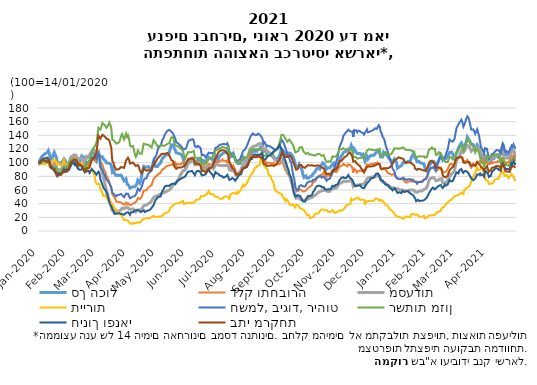
| Category | סך הכול | דלק ותחבורה | מסעדות | תיירות | חשמל, ביגוד, ריהוט | רשתות מזון | חינוך ופנאי | בתי מרקחת |
|---|---|---|---|---|---|---|---|---|
| 2020-01-14 02:00:00 | 100 | 100 | 100 | 100 | 100 | 100 | 100 | 100 |
| 2020-01-15 02:00:00 | 101.719 | 100.675 | 97.889 | 99.187 | 100.368 | 99.831 | 101.454 | 100.52 |
| 2020-01-16 02:00:00 | 105.633 | 101.507 | 98.034 | 98.258 | 101.304 | 100.752 | 99.632 | 102.654 |
| 2020-01-17 02:00:00 | 108.151 | 102.344 | 98.823 | 97.857 | 101.252 | 101.077 | 104.172 | 103.478 |
| 2020-01-19 02:00:00 | 110.992 | 105.256 | 101.43 | 98.079 | 103.331 | 102.45 | 105.805 | 104.144 |
| 2020-01-20 02:00:00 | 111.178 | 103.192 | 100.429 | 97.378 | 102.003 | 101.615 | 104.371 | 102.798 |
| 2020-01-21 02:00:00 | 113.479 | 103.487 | 100.027 | 97.461 | 102.122 | 101.443 | 106.404 | 102.13 |
| 2020-01-22 02:00:00 | 114.641 | 103.743 | 99.753 | 102.685 | 102.122 | 100.95 | 106.817 | 100.976 |
| 2020-01-23 02:00:00 | 114.986 | 103.524 | 100.436 | 103.889 | 102.45 | 101.177 | 107.275 | 101.345 |
| 2020-01-24 02:00:00 | 117.721 | 106.609 | 102.664 | 104.952 | 104.418 | 102.533 | 107.833 | 102.947 |
| 2020-01-25 02:00:00 | 113.464 | 103.999 | 102.363 | 100.911 | 101.921 | 103.315 | 102.781 | 100.925 |
| 2020-01-26 02:00:00 | 107.021 | 97.916 | 94.595 | 96.642 | 94.753 | 93.825 | 96.917 | 93.081 |
| 2020-01-27 02:00:00 | 105.251 | 97.406 | 95.118 | 100.661 | 93.912 | 93.577 | 94.175 | 92.423 |
| 2020-01-28 02:00:00 | 107.242 | 95.445 | 94.555 | 102.276 | 92.051 | 92.396 | 92.933 | 90.928 |
| 2020-01-29 02:00:00 | 111.38 | 96.327 | 94.473 | 104.046 | 89.954 | 92.033 | 90.964 | 90.338 |
| 2020-01-30 02:00:00 | 115.098 | 99.849 | 96.151 | 105.25 | 92.39 | 93.021 | 91.231 | 90.341 |
| 2020-01-31 02:00:00 | 111.621 | 97.377 | 94.997 | 104.581 | 90.288 | 91.893 | 85.803 | 88.161 |
| 2020-02-01 02:00:00 | 108.25 | 94.549 | 95.617 | 101.302 | 88.699 | 93.513 | 82.699 | 87.188 |
| 2020-02-02 02:00:00 | 101.543 | 88.358 | 87.548 | 97.533 | 81.91 | 84.628 | 80.657 | 80.464 |
| 2020-02-03 02:00:00 | 101.785 | 90.542 | 88.887 | 99.883 | 83.316 | 85.655 | 84.454 | 81.676 |
| 2020-02-04 02:00:00 | 99.859 | 90.587 | 89.269 | 100.519 | 83.179 | 85.879 | 83.76 | 81.806 |
| 2020-02-05 02:00:00 | 99.099 | 90.984 | 89.783 | 96.399 | 83.23 | 86.014 | 83.841 | 82.186 |
| 2020-02-06 02:00:00 | 98.222 | 90.545 | 90.21 | 96.225 | 82.773 | 86.142 | 84.734 | 82.392 |
| 2020-02-07 02:00:00 | 97.703 | 90.362 | 90.891 | 96.75 | 82.292 | 86.292 | 84.367 | 82.126 |
| 2020-02-09 02:00:00 | 105.662 | 97.88 | 97.663 | 104.361 | 88.562 | 93.821 | 90.955 | 88.155 |
| 2020-02-10 02:00:00 | 103.636 | 95.556 | 95.475 | 99.274 | 86.435 | 93.483 | 89.142 | 86.505 |
| 2020-02-11 02:00:00 | 100.491 | 95.825 | 95.936 | 97.218 | 86.804 | 94.224 | 89.658 | 87.116 |
| 2020-02-12 02:00:00 | 95.191 | 94.951 | 96.093 | 95.196 | 87.439 | 94.923 | 90.774 | 87.924 |
| 2020-02-13 02:00:00 | 90.377 | 93.073 | 95.613 | 93.881 | 86.568 | 94.93 | 89.582 | 88.46 |
| 2020-02-14 02:00:00 | 93.38 | 96.584 | 99.271 | 94.489 | 92.047 | 98.8 | 89.611 | 91.749 |
| 2020-02-16 02:00:00 | 101.536 | 104.591 | 108.707 | 101.568 | 98.039 | 104.414 | 95.804 | 100.851 |
| 2020-02-17 02:00:00 | 103.605 | 104.858 | 108.703 | 100.023 | 98.947 | 104.459 | 99.492 | 101.633 |
| 2020-02-18 02:00:00 | 104.257 | 105.139 | 109.711 | 99.192 | 99.52 | 104.26 | 98.704 | 102.665 |
| 2020-02-19 02:00:00 | 106.075 | 107.054 | 111.5 | 99.575 | 101.866 | 105.305 | 98.568 | 104.274 |
| 2020-02-20 02:00:00 | 104.535 | 105.161 | 110.417 | 98.567 | 100.268 | 103.775 | 96.525 | 103.419 |
| 2020-02-21 02:00:00 | 105.925 | 105.854 | 110.888 | 102.899 | 101.219 | 104.132 | 99.015 | 103.92 |
| 2020-02-22 02:00:00 | 102.744 | 102.032 | 111.224 | 99.127 | 99.162 | 104.814 | 94.48 | 101.986 |
| 2020-02-23 02:00:00 | 98.285 | 97.319 | 104.088 | 95.454 | 93.448 | 95.587 | 91.306 | 96.193 |
| 2020-02-24 02:00:00 | 100.473 | 99.707 | 106.222 | 95.297 | 96.018 | 96.315 | 92.313 | 98.234 |
| 2020-02-25 02:00:00 | 101.727 | 99.364 | 106.003 | 94.387 | 95.816 | 96.1 | 89.602 | 97.699 |
| 2020-02-26 02:00:00 | 104.764 | 98.872 | 106.635 | 93.646 | 95.546 | 95.946 | 90.157 | 96.51 |
| 2020-02-27 02:00:00 | 109.922 | 99.934 | 106.838 | 99.426 | 95.303 | 95.54 | 90.048 | 95.497 |
| 2020-02-28 02:00:00 | 110.77 | 98.692 | 104.874 | 98.149 | 92.435 | 93.126 | 92.617 | 93.308 |
| 2020-02-29 02:00:00 | 107.864 | 95.535 | 105.712 | 95.238 | 90.942 | 94.896 | 89.065 | 92.184 |
| 2020-03-01 02:00:00 | 104.266 | 93.967 | 98.405 | 91.974 | 88.654 | 89.897 | 85.922 | 86.445 |
| 2020-03-03 02:00:00 | 107.723 | 96.67 | 109.683 | 93.899 | 100.085 | 98.752 | 87.526 | 91.796 |
| 2020-03-04 02:00:00 | 106.619 | 94.586 | 108.375 | 92.089 | 99.224 | 98.327 | 87.485 | 90.827 |
| 2020-03-05 02:00:00 | 108.038 | 97.116 | 109.292 | 91.266 | 101.469 | 100.308 | 87.828 | 92.241 |
| 2020-03-06 02:00:00 | 107.224 | 97.413 | 108.471 | 84.756 | 101.061 | 102.69 | 85.165 | 93.725 |
| 2020-03-08 02:00:00 | 115.291 | 104.878 | 116.022 | 89.549 | 108.438 | 114.274 | 90.747 | 103.157 |
| 2020-03-09 02:00:00 | 117.243 | 106.602 | 117.936 | 87.892 | 109.626 | 118.951 | 89.249 | 105.163 |
| 2020-03-10 02:00:00 | 113.259 | 104.136 | 117.456 | 84.933 | 107.47 | 121.395 | 87.807 | 105.37 |
| 2020-03-11 02:00:00 | 109.121 | 103.596 | 117.904 | 81.863 | 107.87 | 123.358 | 86.39 | 107.5 |
| 2020-03-12 02:00:00 | 103.954 | 102.611 | 117.401 | 71.845 | 107.711 | 124.741 | 86.021 | 110.823 |
| 2020-03-13 02:00:00 | 102.107 | 101.837 | 114.178 | 68.902 | 105.672 | 129.15 | 82.522 | 115.514 |
| 2020-03-15 02:00:00 | 112.893 | 109.767 | 116.43 | 69.147 | 113.355 | 151.094 | 86.794 | 139.217 |
| 2020-03-16 02:00:00 | 112.633 | 106.31 | 109.175 | 67.628 | 109.676 | 150.425 | 84.836 | 139.918 |
| 2020-03-17 02:00:00 | 109.045 | 101.106 | 94.307 | 60.67 | 94.374 | 148.626 | 75.287 | 135.196 |
| 2020-03-18 02:00:00 | 108.389 | 99.095 | 89.722 | 58.197 | 91.285 | 152.452 | 71.262 | 136.634 |
| 2020-03-19 02:00:00 | 108.531 | 97.326 | 85.316 | 55.349 | 89.505 | 158.26 | 67.71 | 140.809 |
| 2020-03-20 02:00:00 | 105.203 | 91.731 | 78.354 | 51.103 | 85.228 | 156.918 | 63.256 | 139.818 |
| 2020-03-22 02:00:00 | 102.98 | 86.171 | 66.185 | 52.196 | 79.857 | 154.023 | 59.757 | 137.392 |
| 2020-03-23 02:00:00 | 99.615 | 80.331 | 60.019 | 48.964 | 75.181 | 151.082 | 56.444 | 135.05 |
| 2020-03-24 02:00:00 | 99.873 | 78.885 | 55.711 | 46.602 | 74.68 | 152.124 | 53.405 | 134.763 |
| 2020-03-25 02:00:00 | 99.537 | 76.109 | 49.61 | 44.72 | 72.283 | 154.924 | 48.09 | 134.163 |
| 2020-03-26 02:00:00 | 98.686 | 71.636 | 44.521 | 42.548 | 69.755 | 158.765 | 42.499 | 132.161 |
| 2020-03-27 03:00:00 | 98.366 | 67.054 | 40.285 | 44.357 | 66.947 | 155.241 | 38.336 | 127.043 |
| 2020-03-28 03:00:00 | 95.898 | 63.28 | 38.998 | 41.801 | 63.38 | 151.775 | 36.34 | 121.831 |
| 2020-03-29 03:00:00 | 87.58 | 54.069 | 30.097 | 39.142 | 56.211 | 133.651 | 32.36 | 102.82 |
| 2020-03-30 03:00:00 | 90.27 | 54.274 | 30.224 | 37.177 | 56.51 | 134.987 | 30.275 | 100.366 |
| 2020-03-31 03:00:00 | 84.833 | 49.558 | 29.007 | 34.09 | 53.456 | 132.123 | 25.257 | 95.457 |
| 2020-04-01 03:00:00 | 84.752 | 47.369 | 28.96 | 32.147 | 53.447 | 132.594 | 25.167 | 94.966 |
| 2020-04-02 03:00:00 | 81.239 | 43.058 | 28.035 | 31.116 | 50.762 | 127.932 | 25.389 | 89.783 |
| 2020-04-03 03:00:00 | 82.341 | 43.204 | 28.733 | 30.276 | 52.456 | 129.037 | 26.089 | 90.962 |
| 2020-04-05 03:00:00 | 81.664 | 42.474 | 29.249 | 24.823 | 53.079 | 129.716 | 26.034 | 90.691 |
| 2020-04-06 03:00:00 | 81.228 | 42.227 | 29.829 | 23.937 | 54.113 | 133.964 | 25.739 | 91.941 |
| 2020-04-07 03:00:00 | 81.755 | 41.753 | 31.166 | 23.451 | 54.147 | 139.173 | 25.285 | 93.675 |
| 2020-04-08 03:00:00 | 81.318 | 40.957 | 33.395 | 22.614 | 53.184 | 141.811 | 24.879 | 94.478 |
| 2020-04-10 03:00:00 | 73.425 | 38.374 | 32.604 | 15.949 | 49.446 | 134.052 | 23.794 | 92.402 |
| 2020-04-12 03:00:00 | 76.159 | 41.493 | 34.639 | 16.341 | 54.714 | 142.463 | 26.455 | 102.973 |
| 2020-04-13 03:00:00 | 69.273 | 39.019 | 33.807 | 15.351 | 53.435 | 137.528 | 27.174 | 103.298 |
| 2020-04-14 03:00:00 | 70.607 | 40.818 | 33.87 | 14.924 | 54.632 | 140.264 | 27.564 | 107.261 |
| 2020-04-15 03:00:00 | 66.077 | 38.599 | 32.55 | 13.229 | 51.143 | 135.52 | 25.827 | 104.498 |
| 2020-04-16 03:00:00 | 62.727 | 37.498 | 31.511 | 10.961 | 47.899 | 125.332 | 23.757 | 98.815 |
| 2020-04-17 03:00:00 | 63.283 | 38.127 | 31.695 | 10.539 | 48.377 | 123.495 | 27.193 | 99.075 |
| 2020-04-19 03:00:00 | 64.789 | 40.263 | 32.369 | 10.577 | 50.347 | 124.42 | 27.48 | 100.193 |
| 2020-04-20 03:00:00 | 64.357 | 39.745 | 31.732 | 12.079 | 49.736 | 119.15 | 28.563 | 98.648 |
| 2020-04-21 03:00:00 | 64.683 | 41.292 | 29.942 | 11.672 | 51.252 | 112.309 | 29.885 | 96.784 |
| 2020-04-22 03:00:00 | 66.693 | 42.805 | 27.887 | 11.477 | 53.331 | 108.433 | 30.804 | 95.017 |
| 2020-04-23 03:00:00 | 68.829 | 44.539 | 28.672 | 11.899 | 56.511 | 111.171 | 30.542 | 94.686 |
| 2020-04-24 03:00:00 | 74.331 | 48.338 | 30.963 | 12.807 | 61.97 | 117.763 | 31.668 | 96.631 |
| 2020-04-25 03:00:00 | 72.357 | 47.486 | 31.164 | 12.156 | 60.708 | 118.632 | 30.038 | 94.339 |
| 2020-04-26 03:00:00 | 70.102 | 46.694 | 30.572 | 12.257 | 58.913 | 112.985 | 28.727 | 88.331 |
| 2020-04-27 03:00:00 | 73.251 | 48.46 | 31.87 | 12.694 | 62.064 | 113.021 | 27.693 | 86.921 |
| 2020-04-28 03:00:00 | 82.697 | 50.267 | 32.58 | 15.337 | 64.845 | 113.257 | 27.798 | 84.358 |
| 2020-04-30 03:00:00 | 94.71 | 59.018 | 37.035 | 17.716 | 74.402 | 127.835 | 30.371 | 91.737 |
| 2020-05-01 03:00:00 | 94.037 | 59.748 | 37.796 | 18.362 | 76.609 | 128.601 | 27.746 | 90.074 |
| 2020-05-03 03:00:00 | 93.188 | 59.734 | 38.151 | 18.751 | 77.551 | 126.407 | 29.332 | 88.218 |
| 2020-05-04 03:00:00 | 94.575 | 62.695 | 39.154 | 17.862 | 82.073 | 126.692 | 29.753 | 88.639 |
| 2020-05-05 03:00:00 | 94.164 | 64.153 | 40.516 | 18.29 | 84.388 | 126.182 | 30.101 | 89.11 |
| 2020-05-06 03:00:00 | 92.201 | 64.982 | 41.189 | 18.981 | 85.956 | 124.213 | 31.114 | 88.195 |
| 2020-05-07 03:00:00 | 91.695 | 65.995 | 41.851 | 19.639 | 87.105 | 123.227 | 31.925 | 87.891 |
| 2020-05-08 03:00:00 | 90.672 | 67.157 | 42.866 | 20.201 | 89.227 | 122.257 | 33.086 | 87.863 |
| 2020-05-10 03:00:00 | 101.85 | 76.175 | 49.032 | 22.241 | 102.142 | 133.066 | 37.779 | 96.685 |
| 2020-05-11 03:00:00 | 102.039 | 77.848 | 49.587 | 22.575 | 105.865 | 131.1 | 42.014 | 97.752 |
| 2020-05-12 03:00:00 | 94.508 | 79.596 | 50.868 | 20.319 | 109.237 | 128.596 | 45.292 | 101.183 |
| 2020-05-13 03:00:00 | 94.399 | 80.254 | 50.707 | 20.512 | 111.178 | 126.939 | 45.646 | 103.175 |
| 2020-05-14 03:00:00 | 94.363 | 81.756 | 51.422 | 20.914 | 117.87 | 123.912 | 48.584 | 105.994 |
| 2020-05-15 03:00:00 | 96.58 | 83.253 | 52.83 | 21.066 | 121.781 | 124.219 | 50.135 | 107.544 |
| 2020-05-17 03:00:00 | 99.44 | 85.28 | 53.929 | 21.349 | 124.96 | 125.098 | 50.291 | 110.705 |
| 2020-05-18 03:00:00 | 102.953 | 86.632 | 54.455 | 21.491 | 128.242 | 124.447 | 54.852 | 112.593 |
| 2020-05-19 03:00:00 | 106.277 | 90.09 | 55.635 | 22.193 | 133.509 | 125.253 | 58.552 | 113.344 |
| 2020-05-20 03:00:00 | 106.535 | 89.687 | 55.551 | 23.944 | 135.179 | 124.013 | 60.22 | 112.959 |
| 2020-05-21 03:00:00 | 109.106 | 91.524 | 56.241 | 25.631 | 139.582 | 124.546 | 64.056 | 113.156 |
| 2020-05-22 03:00:00 | 111.157 | 93.446 | 56.883 | 26.393 | 142.481 | 125.447 | 65.712 | 113.244 |
| 2020-05-24 03:00:00 | 111.578 | 95.488 | 58.612 | 27.196 | 146.606 | 127.338 | 66.231 | 114.232 |
| 2020-05-25 03:00:00 | 111.341 | 95.688 | 59.193 | 28.195 | 147.338 | 127.601 | 65.75 | 112.757 |
| 2020-05-26 03:00:00 | 114.874 | 95.988 | 60.035 | 29.089 | 147.987 | 128.64 | 65.961 | 110.41 |
| 2020-05-27 03:00:00 | 120.222 | 96.415 | 60.9 | 34.145 | 148.568 | 133.007 | 67.693 | 107.386 |
| 2020-05-28 03:00:00 | 126.049 | 96.776 | 63.111 | 34.849 | 145.563 | 136.853 | 68.551 | 103.92 |
| 2020-05-30 03:00:00 | 125.542 | 98.217 | 67.639 | 37.749 | 142.111 | 137.467 | 69.563 | 102.153 |
| 2020-05-31 03:00:00 | 121.33 | 97.835 | 67.793 | 38.198 | 138.578 | 128.298 | 68.352 | 94.675 |
| 2020-06-01 03:00:00 | 118.588 | 100.349 | 69.31 | 39.983 | 135.99 | 127.866 | 68.459 | 92.938 |
| 2020-06-02 03:00:00 | 114.257 | 95.213 | 69.823 | 41.177 | 129.82 | 124.798 | 69.765 | 90.992 |
| 2020-06-03 03:00:00 | 115.27 | 97.843 | 72.603 | 40.649 | 130.562 | 125.007 | 73.05 | 92.44 |
| 2020-06-04 03:00:00 | 113.873 | 97.548 | 74.905 | 39.941 | 128.4 | 123.76 | 73.23 | 92.963 |
| 2020-06-05 03:00:00 | 112.928 | 97.569 | 77.986 | 40.982 | 126.604 | 122.371 | 74.977 | 92.858 |
| 2020-06-07 03:00:00 | 111.938 | 97.668 | 84.038 | 42.241 | 124.318 | 120.331 | 76.627 | 92.824 |
| 2020-06-08 03:00:00 | 110.397 | 98.325 | 85.566 | 42.541 | 122.07 | 118.825 | 77.192 | 93.299 |
| 2020-06-09 03:00:00 | 106.679 | 100.834 | 88.142 | 43.749 | 122.605 | 116.148 | 78.09 | 94.412 |
| 2020-06-10 03:00:00 | 99.9 | 98.978 | 89.11 | 39.378 | 119.381 | 110.388 | 77.626 | 94.016 |
| 2020-06-11 03:00:00 | 94.233 | 98.162 | 89.18 | 39.723 | 119.824 | 105.822 | 79.689 | 95.611 |
| 2020-06-12 03:00:00 | 96.318 | 99.362 | 90.958 | 40.735 | 121.052 | 109.488 | 80.979 | 96.751 |
| 2020-06-14 03:00:00 | 101.323 | 105.561 | 98.946 | 41.535 | 129.919 | 115.385 | 86.617 | 104.4 |
| 2020-06-15 03:00:00 | 102.995 | 103.99 | 99.789 | 41.284 | 132.29 | 115.064 | 87.28 | 104.698 |
| 2020-06-16 03:00:00 | 105.003 | 105.28 | 100.434 | 40.596 | 133.445 | 115.114 | 87.231 | 105.499 |
| 2020-06-17 03:00:00 | 106.023 | 106.03 | 101.537 | 40.952 | 133.724 | 115.534 | 87.668 | 105.797 |
| 2020-06-18 03:00:00 | 106.519 | 106.788 | 102.259 | 41.275 | 134.094 | 115.789 | 87.951 | 106.345 |
| 2020-06-19 03:00:00 | 106.708 | 107.302 | 103.449 | 42.541 | 134.347 | 116.065 | 87.821 | 106.848 |
| 2020-06-20 03:00:00 | 103.911 | 103.808 | 103.575 | 41.493 | 131.495 | 116.942 | 83.997 | 104.843 |
| 2020-06-21 03:00:00 | 99.238 | 99.737 | 96.844 | 40.37 | 123.892 | 107.383 | 81.794 | 98.769 |
| 2020-06-22 03:00:00 | 101.129 | 100.743 | 96.86 | 45.403 | 124.429 | 107.524 | 85.575 | 99.09 |
| 2020-06-23 03:00:00 | 101.545 | 99.073 | 97.096 | 45.257 | 122.796 | 106.965 | 87.528 | 98.282 |
| 2020-06-24 03:00:00 | 103.65 | 101.454 | 98.357 | 45.937 | 124.626 | 107.861 | 88.879 | 99.125 |
| 2020-06-25 03:00:00 | 103.296 | 100.817 | 98.353 | 46.215 | 123.458 | 106.995 | 88.065 | 97.925 |
| 2020-06-26 03:00:00 | 105.717 | 100.163 | 98.326 | 46.849 | 122.522 | 106.414 | 88.272 | 96.519 |
| 2020-06-27 03:00:00 | 103.642 | 97.286 | 98.49 | 51.029 | 120.257 | 107.656 | 85.032 | 95.278 |
| 2020-06-28 03:00:00 | 97.893 | 89.94 | 89.75 | 49.867 | 110.973 | 97.977 | 81.396 | 87.99 |
| 2020-06-29 03:00:00 | 103.23 | 92.215 | 90.379 | 50.807 | 110.313 | 98.632 | 81.857 | 88.066 |
| 2020-06-30 03:00:00 | 103.773 | 95.221 | 90.888 | 51.389 | 111.501 | 99.233 | 82.076 | 88.052 |
| 2020-07-01 03:00:00 | 102.602 | 94.786 | 91.244 | 51.844 | 110.769 | 98.622 | 81.012 | 87.34 |
| 2020-07-02 03:00:00 | 101.095 | 92.279 | 90.37 | 53.101 | 107.877 | 97.543 | 83.073 | 85.687 |
| 2020-07-03 03:00:00 | 101.196 | 91.955 | 89.846 | 53.71 | 107.572 | 97.813 | 83.996 | 85.505 |
| 2020-07-05 03:00:00 | 108.13 | 98.225 | 95.154 | 58.258 | 114.64 | 105.492 | 90.256 | 91.78 |
| 2020-07-06 03:00:00 | 107.24 | 97.302 | 95.317 | 54.42 | 114.29 | 105.866 | 87.29 | 91.669 |
| 2020-07-07 03:00:00 | 106.167 | 96.895 | 94.138 | 54.146 | 113.91 | 106.384 | 85.127 | 91.734 |
| 2020-07-08 03:00:00 | 105.715 | 96.695 | 93.417 | 54.17 | 113.102 | 106.959 | 84.022 | 91.581 |
| 2020-07-09 03:00:00 | 105.07 | 98.124 | 93.561 | 53.956 | 114.17 | 108.312 | 82.233 | 94.188 |
| 2020-07-10 03:00:00 | 100.144 | 95.486 | 91.302 | 53.155 | 111.881 | 107.649 | 78.868 | 95.484 |
| 2020-07-12 03:00:00 | 108.063 | 103.866 | 96.905 | 50.275 | 121.805 | 117.902 | 86.169 | 106.488 |
| 2020-07-13 03:00:00 | 101.728 | 100.806 | 96.146 | 49.816 | 121.105 | 117.546 | 84.601 | 108.258 |
| 2020-07-14 03:00:00 | 103.301 | 101.434 | 97.077 | 49.822 | 122.643 | 119.063 | 83.963 | 112.047 |
| 2020-07-15 03:00:00 | 106.247 | 101.153 | 96.27 | 49.046 | 124.828 | 119.753 | 83.523 | 115.114 |
| 2020-07-16 03:00:00 | 108.925 | 101.986 | 96.108 | 47.405 | 125.619 | 120.587 | 81.52 | 116.291 |
| 2020-07-17 03:00:00 | 111.049 | 102.415 | 95.988 | 47.009 | 126.179 | 121.905 | 80.864 | 117.634 |
| 2020-07-19 03:00:00 | 112.895 | 104.723 | 95.579 | 46.997 | 127.171 | 123.058 | 79.814 | 118.312 |
| 2020-07-20 03:00:00 | 111.925 | 102.595 | 95.047 | 46.469 | 126.248 | 122.249 | 78.003 | 117.533 |
| 2020-07-21 03:00:00 | 114.765 | 102.924 | 95.93 | 50.36 | 127.181 | 122.145 | 78.869 | 117.617 |
| 2020-07-22 03:00:00 | 115.981 | 102.912 | 96.238 | 50.332 | 128.136 | 122.002 | 79.082 | 117.685 |
| 2020-07-23 03:00:00 | 115.281 | 101.004 | 95.743 | 50.457 | 126.647 | 120.958 | 80.608 | 115.093 |
| 2020-07-24 03:00:00 | 117.295 | 103.499 | 97.14 | 51.188 | 128.372 | 122.363 | 82.14 | 113.819 |
| 2020-07-25 03:00:00 | 113.398 | 99.602 | 96.218 | 49.451 | 125.205 | 122.992 | 78.778 | 110.79 |
| 2020-07-26 03:00:00 | 106.743 | 95.007 | 89.719 | 47.459 | 116.562 | 112.192 | 74.736 | 101.518 |
| 2020-07-27 03:00:00 | 106.335 | 94.463 | 89.325 | 53.399 | 114.876 | 111.74 | 75.828 | 99.054 |
| 2020-07-28 03:00:00 | 109.634 | 91.999 | 88.535 | 53.816 | 112.027 | 110.671 | 75.916 | 95.317 |
| 2020-07-29 03:00:00 | 111.616 | 92.899 | 88.452 | 55.064 | 109.782 | 110.86 | 77.669 | 92.351 |
| 2020-07-30 03:00:00 | 113.486 | 95.877 | 88.238 | 55.817 | 112.446 | 111.75 | 77.412 | 92.105 |
| 2020-07-31 03:00:00 | 108.891 | 92.357 | 86.477 | 55.7 | 109.083 | 108.868 | 75.775 | 89.354 |
| 2020-08-01 03:00:00 | 105.873 | 89.504 | 86.431 | 54.743 | 107.918 | 110.118 | 73.476 | 88.307 |
| 2020-08-02 03:00:00 | 101.137 | 85.213 | 81.595 | 53.926 | 102.2 | 100.519 | 74.052 | 82.572 |
| 2020-08-03 03:00:00 | 100.575 | 85.332 | 82.149 | 57.032 | 102.491 | 100.355 | 77.533 | 82.69 |
| 2020-08-04 03:00:00 | 98.623 | 85.298 | 82.607 | 55.299 | 103.449 | 100.342 | 80.009 | 83.011 |
| 2020-08-05 03:00:00 | 98.539 | 85.668 | 84.684 | 56.821 | 104.114 | 100.326 | 81.928 | 83.93 |
| 2020-08-06 03:00:00 | 98.742 | 86.005 | 86.285 | 58.22 | 105.007 | 100.106 | 82.584 | 84.524 |
| 2020-08-07 03:00:00 | 99.021 | 86.381 | 87.558 | 60.742 | 105.727 | 99.576 | 83.256 | 84.514 |
| 2020-08-09 03:00:00 | 108.227 | 95.68 | 97.909 | 67.581 | 116.933 | 107.822 | 91.34 | 92.251 |
| 2020-08-10 03:00:00 | 106.073 | 94.236 | 98.555 | 65.383 | 116.811 | 107.227 | 90.02 | 91.531 |
| 2020-08-11 03:00:00 | 102.439 | 95.453 | 100.334 | 66.826 | 119.656 | 107.912 | 92.342 | 92.722 |
| 2020-08-12 03:00:00 | 99.757 | 95.404 | 102.231 | 68.158 | 121.634 | 107.847 | 92.902 | 94.197 |
| 2020-08-13 03:00:00 | 97.527 | 94.715 | 105.094 | 70.047 | 122.22 | 107.587 | 93.894 | 94.66 |
| 2020-08-14 03:00:00 | 101.719 | 99.337 | 109.564 | 73.68 | 128.466 | 110.262 | 96.827 | 97.289 |
| 2020-08-16 03:00:00 | 109.628 | 105.69 | 119.005 | 79.564 | 136.342 | 117.852 | 104.279 | 105.362 |
| 2020-08-17 03:00:00 | 113.919 | 109.129 | 121.104 | 83.084 | 139.43 | 119.273 | 105.47 | 107.21 |
| 2020-08-18 03:00:00 | 114.95 | 109.977 | 122.143 | 83.499 | 140.062 | 119.595 | 105.212 | 108.098 |
| 2020-08-19 03:00:00 | 116.396 | 112.412 | 123.409 | 85.16 | 142.836 | 120.767 | 109.264 | 108.515 |
| 2020-08-20 03:00:00 | 115.289 | 110.497 | 123.008 | 86.008 | 140.936 | 119.861 | 109.702 | 107.391 |
| 2020-08-21 03:00:00 | 116.839 | 111.123 | 124.572 | 92.474 | 142.127 | 120.292 | 111.993 | 107.967 |
| 2020-08-23 03:00:00 | 116.719 | 109.299 | 125.006 | 93.592 | 140.564 | 119.605 | 111.452 | 107.855 |
| 2020-08-24 03:00:00 | 118.995 | 112.139 | 126.984 | 95.94 | 142.482 | 120.737 | 112.633 | 109.348 |
| 2020-08-25 03:00:00 | 118.563 | 111.658 | 127.401 | 96.313 | 141.779 | 119.91 | 111.128 | 108.828 |
| 2020-08-26 03:00:00 | 119.732 | 111.01 | 128.056 | 96.935 | 140.907 | 119.507 | 111.11 | 108.068 |
| 2020-08-27 03:00:00 | 123.506 | 110.551 | 128.6 | 104.931 | 140.226 | 119.354 | 112.517 | 107.982 |
| 2020-08-28 03:00:00 | 125.485 | 109.073 | 128.034 | 105.548 | 137.103 | 117.807 | 114.123 | 106.735 |
| 2020-08-29 03:00:00 | 122.309 | 106.255 | 127.224 | 101.291 | 133.566 | 118.733 | 109.094 | 104.397 |
| 2020-08-30 03:00:00 | 116.847 | 101.292 | 119.589 | 98.146 | 127.741 | 109.715 | 104.063 | 98.117 |
| 2020-08-31 03:00:00 | 117.719 | 103.765 | 120.177 | 93.606 | 129.659 | 110.434 | 104.872 | 97.47 |
| 2020-09-01 03:00:00 | 117.042 | 103.199 | 119.845 | 92.921 | 128.733 | 110.652 | 105.192 | 97.168 |
| 2020-09-02 03:00:00 | 113.883 | 98.378 | 116.4 | 91.423 | 123.497 | 108.948 | 106.381 | 95.257 |
| 2020-09-03 03:00:00 | 115.928 | 100.185 | 115.668 | 89.813 | 125.126 | 110.859 | 109.705 | 95.835 |
| 2020-09-04 03:00:00 | 114.368 | 99.651 | 113.979 | 82.428 | 123.732 | 111.174 | 109.995 | 95.421 |
| 2020-09-06 03:00:00 | 113.837 | 99.487 | 112.142 | 80.411 | 123.373 | 111.641 | 110.832 | 96.082 |
| 2020-09-07 03:00:00 | 113.304 | 98.944 | 110.37 | 75.243 | 122.735 | 111.86 | 112.797 | 95.998 |
| 2020-09-08 03:00:00 | 111.925 | 98.345 | 108.629 | 73.337 | 121.444 | 112.863 | 114.553 | 95.675 |
| 2020-09-09 03:00:00 | 111.3 | 99.891 | 107.502 | 71.134 | 122.45 | 115.133 | 116.566 | 96.374 |
| 2020-09-10 03:00:00 | 106.111 | 97.444 | 104.787 | 61.869 | 119.115 | 114.928 | 115.509 | 95.59 |
| 2020-09-11 03:00:00 | 105.67 | 97.725 | 103.467 | 58.941 | 119.491 | 117.182 | 118.697 | 96.714 |
| 2020-09-12 03:00:00 | 106.138 | 97.069 | 102.641 | 58.021 | 120.298 | 119.473 | 119.576 | 97.989 |
| 2020-09-13 03:00:00 | 105.871 | 98.687 | 102.885 | 57.124 | 120.759 | 120.219 | 120.015 | 98.834 |
| 2020-09-14 03:00:00 | 106.629 | 97.619 | 102.434 | 55.819 | 121.405 | 123.598 | 123.75 | 102.687 |
| 2020-09-15 03:00:00 | 109.962 | 97.777 | 102.227 | 55.241 | 125.232 | 128.823 | 126.11 | 104.606 |
| 2020-09-16 03:00:00 | 115.246 | 98.805 | 103.134 | 54.408 | 128.296 | 133.889 | 122.429 | 107.959 |
| 2020-09-17 03:00:00 | 120.253 | 101.931 | 105.932 | 54.481 | 133.684 | 140.657 | 120.25 | 112.807 |
| 2020-09-18 03:00:00 | 121.111 | 100.153 | 106.042 | 51.646 | 134.9 | 141.821 | 116.363 | 115.779 |
| 2020-09-19 03:00:00 | 117.15 | 96.735 | 102.232 | 49.133 | 130.088 | 140.328 | 109.595 | 114.428 |
| 2020-09-21 03:00:00 | 113.151 | 89.412 | 94.549 | 43.816 | 121.979 | 135.066 | 102.977 | 108.762 |
| 2020-09-22 03:00:00 | 113.91 | 87.461 | 92.47 | 46.705 | 117.898 | 133.095 | 98.513 | 109.011 |
| 2020-09-23 03:00:00 | 111.917 | 83.647 | 89.185 | 44.936 | 111.779 | 130.512 | 93.383 | 108.198 |
| 2020-09-24 03:00:00 | 114.1 | 83.735 | 86.459 | 43.322 | 110.531 | 131.467 | 90.725 | 109.25 |
| 2020-09-25 03:00:00 | 114.25 | 81.698 | 82.052 | 39.17 | 106.733 | 133.769 | 83.277 | 110.693 |
| 2020-09-26 03:00:00 | 114.073 | 79.97 | 76.952 | 38.027 | 101.99 | 132.041 | 80.238 | 110.267 |
| 2020-09-27 03:00:00 | 113.582 | 76.036 | 71.92 | 37.714 | 99.863 | 131.408 | 77.849 | 108.807 |
| 2020-09-29 03:00:00 | 108.159 | 68.181 | 64.233 | 38.579 | 80.694 | 125.32 | 58.373 | 100.574 |
| 2020-09-30 03:00:00 | 104.052 | 66.921 | 60.195 | 36.579 | 76.704 | 120.554 | 53.969 | 97.917 |
| 2020-10-01 03:00:00 | 97.671 | 60.683 | 53.553 | 34.653 | 66.463 | 115.083 | 50.286 | 93.007 |
| 2020-10-02 03:00:00 | 94.082 | 58.038 | 48.086 | 38.125 | 60.854 | 114.088 | 51.063 | 89.754 |
| 2020-10-04 03:00:00 | 94.791 | 58.757 | 49.273 | 37.618 | 59.854 | 116.646 | 52.393 | 91.401 |
| 2020-10-05 03:00:00 | 97.723 | 61.545 | 47.759 | 38.336 | 65.475 | 120.828 | 53.372 | 96.293 |
| 2020-10-06 03:00:00 | 94.728 | 60.922 | 46.629 | 32.96 | 66.373 | 122.68 | 51.187 | 96.592 |
| 2020-10-07 03:00:00 | 92.131 | 60.113 | 45.623 | 32.46 | 67.015 | 123.367 | 48.253 | 96.583 |
| 2020-10-08 03:00:00 | 88.57 | 59.395 | 45.688 | 32.416 | 66.922 | 122.561 | 45.533 | 96.182 |
| 2020-10-09 03:00:00 | 81.944 | 57.854 | 44.938 | 31.839 | 65.369 | 117.585 | 43.099 | 93.373 |
| 2020-10-10 03:00:00 | 78.441 | 57.524 | 45.006 | 30.357 | 64.813 | 115.571 | 42.693 | 92.06 |
| 2020-10-11 03:00:00 | 77.905 | 58.15 | 45.301 | 28.432 | 65.115 | 115.453 | 43.035 | 92.397 |
| 2020-10-12 03:00:00 | 80.446 | 59.791 | 45.241 | 27.989 | 67.214 | 112.858 | 46.108 | 94.035 |
| 2020-10-13 03:00:00 | 77.282 | 60.658 | 46.402 | 23.422 | 70.322 | 112.915 | 48.941 | 95.182 |
| 2020-10-14 03:00:00 | 77.574 | 62.986 | 47.354 | 23.225 | 71.3 | 114.37 | 51.228 | 96.342 |
| 2020-10-15 03:00:00 | 77.92 | 63.943 | 47.587 | 23.074 | 72.273 | 112.098 | 51.225 | 95.945 |
| 2020-10-16 03:00:00 | 79.425 | 64.778 | 47.941 | 19.015 | 72.247 | 110.709 | 51.406 | 95.7 |
| 2020-10-18 03:00:00 | 80.543 | 66.764 | 49.062 | 19.843 | 72.545 | 111.632 | 52.408 | 96.442 |
| 2020-10-19 03:00:00 | 83.37 | 70.671 | 50.572 | 20.966 | 74.737 | 112.11 | 56.73 | 96.813 |
| 2020-10-20 03:00:00 | 83.468 | 70.646 | 50.854 | 21.502 | 74.364 | 110.584 | 58.396 | 95.239 |
| 2020-10-21 03:00:00 | 86.118 | 72.689 | 51.755 | 24.833 | 75.429 | 110.585 | 61.091 | 95.396 |
| 2020-10-22 03:00:00 | 87.353 | 74.742 | 52.918 | 24.927 | 76.847 | 110.95 | 63.735 | 95.465 |
| 2020-10-23 03:00:00 | 91.352 | 77.059 | 54.411 | 25.591 | 78.025 | 111.768 | 65.441 | 95.484 |
| 2020-10-24 03:00:00 | 92.532 | 79.216 | 55.859 | 26.105 | 79.245 | 113.037 | 65.933 | 96.072 |
| 2020-10-25 02:00:00 | 92.367 | 80.718 | 57.082 | 26.357 | 79.416 | 113.07 | 66.334 | 96.159 |
| 2020-10-26 02:00:00 | 90.798 | 81.457 | 57.677 | 26.685 | 79.604 | 112.469 | 65.988 | 95.317 |
| 2020-10-27 02:00:00 | 94.611 | 82.221 | 58.127 | 31.154 | 80.052 | 111.657 | 65.755 | 94.715 |
| 2020-10-28 02:00:00 | 97.227 | 81.283 | 58.213 | 31.562 | 78.198 | 110.055 | 64.004 | 92.74 |
| 2020-10-29 02:00:00 | 99.721 | 83.186 | 59.013 | 31.698 | 78.143 | 109.892 | 64.75 | 92.154 |
| 2020-10-30 02:00:00 | 100.178 | 85.878 | 60.553 | 31.823 | 79.999 | 110.928 | 64.255 | 91.941 |
| 2020-10-31 02:00:00 | 97.073 | 84.214 | 60.725 | 30.552 | 77.729 | 112.207 | 61.553 | 90.712 |
| 2020-11-01 02:00:00 | 93.663 | 83.4 | 58.788 | 30.115 | 76.228 | 103.089 | 60.498 | 85.505 |
| 2020-11-02 02:00:00 | 91.023 | 79.446 | 57.531 | 30.441 | 73.595 | 101.123 | 60.46 | 83.311 |
| 2020-11-03 02:00:00 | 92.628 | 81.41 | 58.141 | 30.536 | 75.44 | 102.037 | 61.502 | 84.35 |
| 2020-11-04 02:00:00 | 91.899 | 81.477 | 58.188 | 27.926 | 75.952 | 101.969 | 61.06 | 83.996 |
| 2020-11-05 02:00:00 | 92.278 | 81.192 | 57.873 | 27.815 | 76.321 | 101.553 | 60.729 | 83.129 |
| 2020-11-06 02:00:00 | 90.816 | 80.787 | 57.774 | 28.166 | 77.548 | 101.467 | 61.317 | 82.317 |
| 2020-11-08 02:00:00 | 97.722 | 86.764 | 62.296 | 30.491 | 85.243 | 109.29 | 66.199 | 89.094 |
| 2020-11-09 02:00:00 | 99.255 | 88.558 | 62.923 | 30.887 | 89.905 | 109.7 | 65.857 | 89.494 |
| 2020-11-10 02:00:00 | 94.969 | 86.612 | 62.347 | 26.595 | 90.954 | 108.571 | 65.147 | 88.615 |
| 2020-11-11 02:00:00 | 93.218 | 87.162 | 62.89 | 27.019 | 96.793 | 109.125 | 67.406 | 90.282 |
| 2020-11-12 02:00:00 | 91.697 | 86.458 | 63.26 | 27.327 | 102.722 | 109.648 | 67.905 | 91.542 |
| 2020-11-13 02:00:00 | 93.228 | 86.369 | 63.749 | 27.514 | 106.58 | 109.927 | 67.808 | 93.001 |
| 2020-11-15 02:00:00 | 103.463 | 94.154 | 69.939 | 30.013 | 122.855 | 119.179 | 74.222 | 102.077 |
| 2020-11-16 02:00:00 | 107.021 | 94.501 | 69.945 | 29.301 | 126.433 | 119.411 | 73.788 | 102.629 |
| 2020-11-17 02:00:00 | 110.168 | 95.074 | 70.265 | 29.466 | 129.449 | 119.485 | 77.9 | 102.597 |
| 2020-11-18 02:00:00 | 111.716 | 95.364 | 70.831 | 30.528 | 133.188 | 119.278 | 78.301 | 103.935 |
| 2020-11-19 02:00:00 | 114.874 | 98.195 | 72.675 | 31.509 | 139.404 | 121.003 | 78.733 | 106.149 |
| 2020-11-20 02:00:00 | 114.573 | 96.545 | 72.595 | 32.241 | 140.333 | 119.458 | 77.136 | 107.991 |
| 2020-11-22 02:00:00 | 116.693 | 96.362 | 72.522 | 37.275 | 144.979 | 119.226 | 77.781 | 109.531 |
| 2020-11-23 02:00:00 | 116.37 | 94.776 | 72.089 | 38.013 | 145.092 | 118.558 | 78.74 | 111.044 |
| 2020-11-24 02:00:00 | 119.653 | 97.41 | 73.164 | 38.781 | 148.324 | 119.796 | 81.849 | 113.768 |
| 2020-11-25 02:00:00 | 117.854 | 97.093 | 73.279 | 38.869 | 148.076 | 119.383 | 79.06 | 114.116 |
| 2020-11-26 02:00:00 | 120.555 | 96.42 | 73.052 | 39.424 | 145.644 | 118.832 | 77.378 | 114.244 |
| 2020-11-27 02:00:00 | 125.195 | 95.703 | 72.387 | 47.274 | 146.226 | 118.023 | 78.587 | 111.869 |
| 2020-11-28 02:00:00 | 121.477 | 93.058 | 72.047 | 45.279 | 145.805 | 118.317 | 74.927 | 109.349 |
| 2020-11-29 02:00:00 | 116.05 | 85.534 | 65.714 | 44.217 | 137.719 | 107.54 | 71.621 | 101.601 |
| 2020-11-30 02:00:00 | 120.26 | 90.997 | 67.516 | 45.832 | 147.704 | 108.996 | 70.366 | 102.792 |
| 2020-12-01 02:00:00 | 117.832 | 90.457 | 67.706 | 47.277 | 149.052 | 108.62 | 65.385 | 102.301 |
| 2020-12-02 02:00:00 | 115.337 | 88.054 | 66.762 | 48.112 | 147.024 | 107.168 | 66.677 | 99.685 |
| 2020-12-03 02:00:00 | 113.419 | 85.592 | 65.817 | 47.882 | 144.483 | 105.77 | 66.156 | 98.19 |
| 2020-12-04 02:00:00 | 114.217 | 87.722 | 66.884 | 48.901 | 146.939 | 107.105 | 67.204 | 96.893 |
| 2020-12-06 02:00:00 | 113.491 | 88.374 | 68.201 | 45.504 | 146.082 | 107.047 | 67.065 | 94.579 |
| 2020-12-07 02:00:00 | 112.813 | 88.036 | 68.209 | 45.835 | 144.312 | 107.088 | 65.753 | 91.966 |
| 2020-12-08 02:00:00 | 110.481 | 87.56 | 68.243 | 46.021 | 143.36 | 107.169 | 63.126 | 89.9 |
| 2020-12-09 02:00:00 | 111.989 | 89.259 | 69.042 | 46.189 | 143.559 | 108.189 | 63.603 | 88.352 |
| 2020-12-10 02:00:00 | 106.391 | 87.71 | 68.462 | 45.724 | 141.134 | 107.245 | 62.675 | 85.598 |
| 2020-12-11 02:00:00 | 102.014 | 88.696 | 69.379 | 39.843 | 141.088 | 108.279 | 63.512 | 86.558 |
| 2020-12-13 02:00:00 | 109.067 | 97.221 | 76.393 | 43.619 | 148.701 | 117.919 | 69.78 | 93.926 |
| 2020-12-14 02:00:00 | 105.464 | 96.315 | 77.625 | 44.163 | 144.372 | 118.95 | 70.618 | 94.425 |
| 2020-12-15 02:00:00 | 107.705 | 96.608 | 78.283 | 43.902 | 144.617 | 119.551 | 72.721 | 94.422 |
| 2020-12-16 02:00:00 | 109.762 | 97.323 | 78.721 | 43.194 | 145.319 | 120.215 | 72.451 | 94.865 |
| 2020-12-17 02:00:00 | 110.372 | 97.858 | 78.692 | 44.219 | 145.685 | 119.291 | 76.991 | 94.333 |
| 2020-12-18 02:00:00 | 110.781 | 97.947 | 78.851 | 44.034 | 146.724 | 118.654 | 77.746 | 94.573 |
| 2020-12-20 02:00:00 | 110.631 | 98.201 | 79.599 | 44.346 | 148.202 | 118.015 | 77.937 | 95.203 |
| 2020-12-21 02:00:00 | 112.559 | 98.868 | 79.983 | 43.696 | 150.258 | 118.661 | 80.287 | 96.128 |
| 2020-12-22 02:00:00 | 114.427 | 99.617 | 80.217 | 47.79 | 150.881 | 118.816 | 83.274 | 96.679 |
| 2020-12-23 02:00:00 | 113.759 | 98.119 | 79.527 | 47.266 | 149.326 | 117.74 | 83.44 | 96.487 |
| 2020-12-24 02:00:00 | 116.565 | 100.27 | 80.555 | 47.025 | 152.414 | 119.243 | 84.493 | 98.181 |
| 2020-12-25 02:00:00 | 117.222 | 100.085 | 80.861 | 46.028 | 154.936 | 119.647 | 82.115 | 98.865 |
| 2020-12-26 02:00:00 | 113.934 | 97.771 | 80.559 | 44.035 | 152.277 | 120.269 | 78.064 | 97.339 |
| 2020-12-27 02:00:00 | 108.048 | 92.297 | 75.051 | 45.866 | 144.82 | 110.664 | 74.592 | 91.55 |
| 2020-12-28 02:00:00 | 107.961 | 89.908 | 73.309 | 45.537 | 143.024 | 109.866 | 74.551 | 91.169 |
| 2020-12-29 02:00:00 | 108.464 | 88.614 | 71.498 | 43.824 | 137.272 | 109.396 | 73.585 | 90.672 |
| 2020-12-30 02:00:00 | 115.093 | 92.342 | 71.491 | 42.381 | 135.693 | 111.711 | 74.729 | 91.664 |
| 2020-12-31 02:00:00 | 114.054 | 91.581 | 70.841 | 40.299 | 131.705 | 113.298 | 69.529 | 91.809 |
| 2021-01-01 02:00:00 | 112.097 | 89.427 | 70.927 | 38.016 | 125.04 | 115.176 | 67.713 | 92.278 |
| 2021-01-03 02:00:00 | 109.465 | 85.457 | 66.879 | 36.964 | 116.83 | 111.724 | 67.806 | 91.706 |
| 2021-01-04 02:00:00 | 107.04 | 84.521 | 65.99 | 36.646 | 111.265 | 111.35 | 66.262 | 91.432 |
| 2021-01-05 02:00:00 | 105.113 | 83.841 | 65.046 | 31.754 | 106.988 | 111.408 | 63.398 | 92.957 |
| 2021-01-06 02:00:00 | 103.792 | 82.78 | 64.112 | 30.773 | 102.516 | 111.56 | 62.032 | 94.153 |
| 2021-01-07 02:00:00 | 102.698 | 82.276 | 63.381 | 30.37 | 98.192 | 113.127 | 61.071 | 95.826 |
| 2021-01-08 02:00:00 | 100.743 | 81.571 | 62.423 | 29.187 | 91.182 | 113.241 | 59.446 | 96.958 |
| 2021-01-10 02:00:00 | 105.59 | 83.292 | 62.852 | 25.18 | 86.961 | 121.063 | 62.474 | 103.507 |
| 2021-01-11 02:00:00 | 103.452 | 81.168 | 61.597 | 22.283 | 79.553 | 120.348 | 60.964 | 103.664 |
| 2021-01-12 02:00:00 | 100.409 | 80.828 | 61.711 | 21.863 | 79.042 | 120.721 | 59.869 | 105.122 |
| 2021-01-13 02:00:00 | 91.74 | 76.642 | 61.171 | 21.246 | 76.602 | 119.426 | 55.732 | 105.924 |
| 2021-01-14 02:00:00 | 93.139 | 76.945 | 61.655 | 21.099 | 76.878 | 120.529 | 55.882 | 107.794 |
| 2021-01-15 02:00:00 | 94.085 | 76.051 | 60.125 | 20.674 | 76.33 | 119.91 | 56.664 | 106.613 |
| 2021-01-17 02:00:00 | 95.534 | 75.71 | 59.803 | 19.336 | 76.589 | 121.283 | 55.491 | 106.446 |
| 2021-01-18 02:00:00 | 98.085 | 74.904 | 59.485 | 18.093 | 77.128 | 121.202 | 58.376 | 105.936 |
| 2021-01-19 02:00:00 | 100.534 | 75.491 | 59.891 | 17.919 | 78.005 | 122.314 | 57.99 | 105.388 |
| 2021-01-20 02:00:00 | 99.144 | 72.935 | 58.771 | 17.625 | 76.38 | 120.823 | 57.068 | 102.622 |
| 2021-01-21 02:00:00 | 99.671 | 71.618 | 58.28 | 21.175 | 75.804 | 118.729 | 58.089 | 100.176 |
| 2021-01-22 02:00:00 | 100.407 | 70.697 | 57.838 | 20.721 | 74.843 | 117.9 | 58.282 | 99.06 |
| 2021-01-24 02:00:00 | 102.024 | 72.196 | 59.199 | 20.821 | 75.842 | 118.712 | 58.276 | 100.38 |
| 2021-01-25 02:00:00 | 101.192 | 72.665 | 59.606 | 20.635 | 75.69 | 118.319 | 56.126 | 100.261 |
| 2021-01-26 02:00:00 | 101.531 | 72.981 | 60.16 | 20.347 | 75.902 | 118.124 | 54.774 | 100.155 |
| 2021-01-27 02:00:00 | 107.231 | 73.441 | 60.503 | 24.67 | 76.084 | 118.533 | 54.118 | 99.382 |
| 2021-01-28 02:00:00 | 108.299 | 72.309 | 60.03 | 25.249 | 74.512 | 117.168 | 53.151 | 98.073 |
| 2021-01-29 02:00:00 | 112.962 | 74.908 | 60.09 | 25.262 | 75.365 | 116.15 | 52.304 | 98.438 |
| 2021-01-30 02:00:00 | 109.415 | 72.427 | 59.441 | 23.918 | 72.543 | 116.146 | 49.593 | 95.81 |
| 2021-01-31 02:00:00 | 106.896 | 71.724 | 57.027 | 23.51 | 72.177 | 109.841 | 47.965 | 91.161 |
| 2021-02-01 02:00:00 | 104.932 | 72.5 | 57.404 | 23.761 | 71.517 | 110.159 | 43.493 | 91.386 |
| 2021-02-02 02:00:00 | 101.318 | 69.376 | 56.628 | 24.223 | 69.304 | 107.999 | 43.988 | 89.377 |
| 2021-02-03 02:00:00 | 102.518 | 71.5 | 57.838 | 24.58 | 71.58 | 108.853 | 45.62 | 91.01 |
| 2021-02-04 02:00:00 | 101.68 | 72.114 | 58.348 | 20.907 | 71.842 | 109.481 | 44.048 | 91.783 |
| 2021-02-05 02:00:00 | 99.796 | 72.301 | 58.422 | 21.003 | 71.546 | 108.98 | 44.017 | 90.442 |
| 2021-02-07 02:00:00 | 98.971 | 72.768 | 58.718 | 21.095 | 71.712 | 109.06 | 44.163 | 89.388 |
| 2021-02-08 02:00:00 | 98.594 | 73.36 | 59.275 | 21.775 | 72.499 | 108.78 | 44.571 | 88.292 |
| 2021-02-09 02:00:00 | 98.1 | 75.634 | 60.834 | 22.343 | 74.779 | 109.358 | 45.182 | 88.35 |
| 2021-02-10 02:00:00 | 91.488 | 74.692 | 61.139 | 18.74 | 74.361 | 107.325 | 45.466 | 87.204 |
| 2021-02-11 02:00:00 | 90.274 | 76.421 | 62.443 | 18.718 | 76.548 | 107.721 | 47.715 | 88.107 |
| 2021-02-12 02:00:00 | 87.396 | 77.137 | 64.088 | 19.72 | 78.7 | 108.491 | 49.341 | 89.353 |
| 2021-02-14 02:00:00 | 94.973 | 88.628 | 73.761 | 22.657 | 87.186 | 119.191 | 55.121 | 99.154 |
| 2021-02-15 02:00:00 | 96.081 | 89.499 | 76.319 | 23.103 | 90.457 | 119.62 | 57.534 | 101.981 |
| 2021-02-16 02:00:00 | 99.104 | 91.311 | 77.296 | 22.761 | 92.065 | 120.452 | 58.543 | 103.158 |
| 2021-02-17 02:00:00 | 101.392 | 92.932 | 77.864 | 23.006 | 92.806 | 122.377 | 62.104 | 102.864 |
| 2021-02-18 02:00:00 | 100.741 | 92.85 | 77.341 | 23.324 | 92.567 | 120.272 | 63.594 | 100.851 |
| 2021-02-19 02:00:00 | 101.54 | 93.299 | 78.077 | 24.179 | 94.058 | 120.522 | 64.263 | 101.018 |
| 2021-02-20 02:00:00 | 98.107 | 90.369 | 76.943 | 23.582 | 90.759 | 120.525 | 60.847 | 98.334 |
| 2021-02-21 02:00:00 | 96.279 | 88.368 | 73.579 | 25.075 | 87.929 | 111.252 | 60.138 | 93.16 |
| 2021-02-22 02:00:00 | 98.273 | 89.817 | 74.365 | 27.129 | 94.075 | 112.261 | 63.978 | 93.745 |
| 2021-02-23 02:00:00 | 98.867 | 89.363 | 74.156 | 27.7 | 97.926 | 112.366 | 64.663 | 93.305 |
| 2021-02-24 02:00:00 | 102.949 | 91.992 | 75.455 | 28.418 | 103.941 | 115.211 | 66.158 | 94.078 |
| 2021-02-25 02:00:00 | 107.34 | 91.96 | 76.159 | 28.726 | 106.359 | 114.741 | 66.138 | 92.463 |
| 2021-02-26 02:00:00 | 111.621 | 93.213 | 76.437 | 29.651 | 108.288 | 113.881 | 67.239 | 90.847 |
| 2021-02-27 02:00:00 | 111.066 | 91.386 | 76.549 | 33.58 | 106.38 | 114.004 | 64.662 | 88.838 |
| 2021-02-28 02:00:00 | 107.115 | 85.546 | 70.796 | 33.547 | 102.994 | 104.617 | 62.929 | 81.719 |
| 2021-03-01 02:00:00 | 107.215 | 86.652 | 70.307 | 34.926 | 105.433 | 104.175 | 64.677 | 79.723 |
| 2021-03-02 02:00:00 | 105.672 | 86.198 | 70.088 | 36.497 | 107.344 | 102.675 | 67.914 | 78.517 |
| 2021-03-03 02:00:00 | 104.97 | 86.166 | 70.485 | 38.872 | 110.749 | 100.923 | 66.319 | 78.601 |
| 2021-03-04 02:00:00 | 106.66 | 87.6 | 71.714 | 40.105 | 115.543 | 101.588 | 66.856 | 79.738 |
| 2021-03-05 02:00:00 | 107.336 | 88.877 | 72.279 | 41.608 | 118.864 | 100.727 | 67.908 | 80.798 |
| 2021-03-07 02:00:00 | 114.922 | 97.129 | 79.831 | 44.673 | 133.584 | 108.397 | 74.713 | 88.869 |
| 2021-03-08 02:00:00 | 114.073 | 96.714 | 80.875 | 44.565 | 132.109 | 107.59 | 72.811 | 89.907 |
| 2021-03-09 02:00:00 | 115.553 | 98.479 | 83.702 | 46.02 | 133.077 | 107.511 | 73.451 | 92.148 |
| 2021-03-10 02:00:00 | 112.891 | 96.713 | 84.264 | 47.142 | 130.774 | 104.474 | 72.921 | 92.25 |
| 2021-03-11 02:00:00 | 109.917 | 97.728 | 86.395 | 49.102 | 132.388 | 104.305 | 75.546 | 94.585 |
| 2021-03-12 02:00:00 | 107.215 | 97.418 | 88.942 | 51.229 | 135.139 | 104.595 | 76.873 | 95.703 |
| 2021-03-14 02:00:00 | 114.194 | 107.485 | 103.246 | 51.455 | 150.543 | 115.204 | 85.806 | 106.478 |
| 2021-03-15 02:00:00 | 116.725 | 107.117 | 104.678 | 52.47 | 153.372 | 116.469 | 86.083 | 106.44 |
| 2021-03-16 02:00:00 | 121.364 | 108.071 | 107.199 | 53.027 | 156.309 | 119.036 | 84.229 | 107.334 |
| 2021-03-17 02:00:00 | 124.698 | 109.021 | 110.069 | 52.943 | 158.399 | 121.679 | 89.182 | 107.494 |
| 2021-03-18 02:00:00 | 126.402 | 109.988 | 113.376 | 54.244 | 160.441 | 123.646 | 89.99 | 108.391 |
| 2021-03-19 02:00:00 | 128.742 | 110.506 | 117.306 | 56.335 | 162.935 | 125.282 | 90.72 | 108.186 |
| 2021-03-20 02:00:00 | 125.59 | 107.934 | 118.014 | 55.238 | 159.269 | 125.776 | 86.709 | 106.293 |
| 2021-03-21 02:00:00 | 121.267 | 102.297 | 114.925 | 54.065 | 152.445 | 117.096 | 85.062 | 100.356 |
| 2021-03-22 02:00:00 | 124.326 | 103.321 | 116.956 | 60.382 | 155.481 | 120.124 | 87.471 | 101.054 |
| 2021-03-23 02:00:00 | 127.715 | 102.137 | 117.874 | 61.927 | 156.236 | 123.928 | 88.149 | 99.675 |
| 2021-03-24 02:00:00 | 130.29 | 102.468 | 122.863 | 62.513 | 164.504 | 129.194 | 87.707 | 100.916 |
| 2021-03-25 02:00:00 | 137.482 | 104.057 | 124.996 | 63.431 | 167.85 | 134.331 | 87.776 | 101.099 |
| 2021-03-26 03:00:00 | 135.056 | 101.404 | 125.839 | 62.677 | 166.267 | 133.463 | 85.002 | 101.279 |
| 2021-03-27 03:00:00 | 132.247 | 97.626 | 124.317 | 65.128 | 161.794 | 133.585 | 82.314 | 100.808 |
| 2021-03-29 03:00:00 | 127.194 | 92.72 | 116.731 | 71.602 | 148.423 | 127.096 | 76.899 | 95.408 |
| 2021-03-30 03:00:00 | 127.683 | 94.836 | 118.046 | 77.448 | 148.191 | 125.918 | 75.853 | 96.386 |
| 2021-03-31 03:00:00 | 126.579 | 98.313 | 119.532 | 79.615 | 148.735 | 123.817 | 74.246 | 96.779 |
| 2021-04-01 03:00:00 | 123.781 | 98.1 | 119.884 | 82.354 | 145.799 | 120.2 | 74.37 | 96.453 |
| 2021-04-02 03:00:00 | 119.735 | 95.351 | 118.406 | 85.361 | 142.148 | 114.685 | 76.614 | 95.428 |
| 2021-04-04 03:00:00 | 126.316 | 101.311 | 122.782 | 93.389 | 148.797 | 120.439 | 82.889 | 100.741 |
| 2021-04-05 03:00:00 | 124.275 | 100.809 | 122.289 | 89.162 | 144.05 | 117.955 | 82.112 | 98.805 |
| 2021-04-06 03:00:00 | 119.421 | 100.697 | 120.342 | 89.008 | 138.785 | 113.538 | 82.313 | 97.846 |
| 2021-04-07 03:00:00 | 117.934 | 102.681 | 116.471 | 89.827 | 129.974 | 109.086 | 84.291 | 96.387 |
| 2021-04-08 03:00:00 | 107.291 | 100.328 | 110.554 | 89.866 | 122.03 | 100.526 | 81.862 | 93.626 |
| 2021-04-09 03:00:00 | 107.371 | 102.753 | 109.822 | 92.492 | 120.4 | 100.283 | 82.564 | 92.758 |
| 2021-04-10 03:00:00 | 105.996 | 105.028 | 111.398 | 88.216 | 119.588 | 99.828 | 82.463 | 91.311 |
| 2021-04-11 03:00:00 | 101.154 | 101.01 | 109.561 | 83.993 | 113.306 | 94.897 | 79.563 | 87.868 |
| 2021-04-12 03:00:00 | 105.092 | 101.299 | 109.78 | 79.165 | 121.306 | 98.088 | 85.713 | 91.06 |
| 2021-04-13 03:00:00 | 103.257 | 101.725 | 110.145 | 74.484 | 120.7 | 101.799 | 87.493 | 91.382 |
| 2021-04-14 03:00:00 | 104.442 | 100.196 | 108.154 | 73.417 | 120.093 | 109.167 | 86.064 | 94.943 |
| 2021-04-15 03:00:00 | 103.541 | 97.39 | 105.926 | 73.039 | 112.948 | 110.468 | 83.79 | 90.051 |
| 2021-04-16 03:00:00 | 100.626 | 96.682 | 103.5 | 68.887 | 105.848 | 107.702 | 79.12 | 86.954 |
| 2021-04-18 03:00:00 | 102.898 | 98.432 | 107.845 | 69.164 | 109.415 | 110.317 | 80.817 | 89.22 |
| 2021-04-19 03:00:00 | 105.624 | 101.265 | 108.264 | 69.92 | 112.465 | 111.397 | 86.646 | 92.549 |
| 2021-04-20 03:00:00 | 104.488 | 99.262 | 107.153 | 69.683 | 111.865 | 109.788 | 86.447 | 92.265 |
| 2021-04-21 03:00:00 | 105.931 | 99.947 | 107.217 | 70.164 | 113.696 | 110.092 | 89.173 | 93.026 |
| 2021-04-22 03:00:00 | 108.659 | 100.856 | 110.181 | 75.325 | 116.257 | 112.08 | 90.719 | 94.201 |
| 2021-04-23 03:00:00 | 109.22 | 101.249 | 110.638 | 75.932 | 117.506 | 112.305 | 92.32 | 94.902 |
| 2021-04-24 03:00:00 | 109.195 | 100.44 | 109.962 | 76.055 | 118.377 | 111.816 | 92.065 | 95.456 |
| 2021-04-25 03:00:00 | 109.087 | 102.297 | 111.887 | 76.317 | 118.621 | 111.272 | 91.303 | 95.464 |
| 2021-04-26 03:00:00 | 107.176 | 101.752 | 111.415 | 76.726 | 117.941 | 109.816 | 89.455 | 94.965 |
| 2021-04-27 03:00:00 | 111.203 | 101.028 | 110.466 | 82.13 | 117.189 | 106.293 | 89.017 | 94.16 |
| 2021-04-28 03:00:00 | 112.1 | 99.478 | 110.703 | 84.336 | 113.821 | 98.396 | 88.298 | 90.063 |
| 2021-04-29 03:00:00 | 120.379 | 106.552 | 113.386 | 84.34 | 123.139 | 100.377 | 95.031 | 95.809 |
| 2021-04-30 03:00:00 | 123.712 | 108.005 | 115.035 | 86.9 | 128.347 | 104.966 | 98.757 | 98.096 |
| 2021-05-01 03:00:00 | 120.43 | 105.897 | 115.24 | 84.161 | 125.874 | 106.187 | 95.5 | 96.389 |
| 2021-05-02 03:00:00 | 114.347 | 100.795 | 106.879 | 80.478 | 117.618 | 96.944 | 94.062 | 89.747 |
| 2021-05-03 03:00:00 | 111.854 | 98.447 | 105.801 | 81.032 | 115.105 | 95.514 | 90.706 | 87.028 |
| 2021-05-04 03:00:00 | 113.232 | 100.469 | 106.782 | 81.733 | 116.706 | 96.331 | 91.692 | 87.445 |
| 2021-05-05 03:00:00 | 112.043 | 100.521 | 106.694 | 81.983 | 115.716 | 95.877 | 90.646 | 87.165 |
| 2021-05-06 03:00:00 | 110.343 | 100.264 | 106.646 | 77.395 | 114.882 | 95.581 | 90.648 | 86.922 |
| 2021-05-07 03:00:00 | 110.88 | 100.001 | 106.567 | 77.428 | 114.466 | 95.266 | 90.3 | 86.507 |
| 2021-05-09 03:00:00 | 120.273 | 109.597 | 115.739 | 83.586 | 125.053 | 103.621 | 99.301 | 93.886 |
| 2021-05-10 03:00:00 | 118.547 | 107.306 | 114.794 | 82.632 | 123.154 | 102.85 | 97.38 | 92.765 |
| 2021-05-11 03:00:00 | 117.747 | 110.687 | 116.988 | 78.67 | 126.958 | 105.67 | 102.394 | 94.864 |
| 2021-05-12 03:00:00 | 113.083 | 107.9 | 114.889 | 75.857 | 125.604 | 106.326 | 103.001 | 94.298 |
| 2021-05-13 03:00:00 | 106.387 | 101.778 | 111.248 | 72.894 | 119.837 | 106.965 | 96.59 | 92.554 |